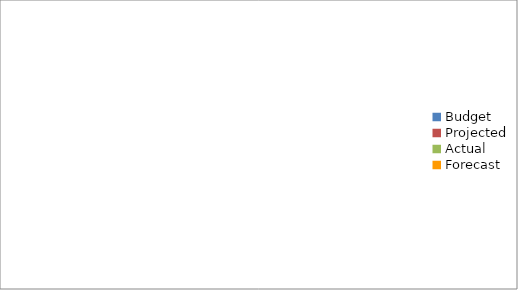
| Category | Series 0 |
|---|---|
| Budget | 1110 |
| Projected | 2520 |
| Actual | 2830 |
| Forecast | 1300 |